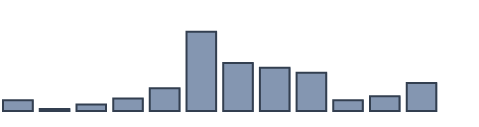
| Category | Series 0 |
|---|---|
| 0 | 3.416 |
| 1 | 0.616 |
| 2 | 2.044 |
| 3 | 3.952 |
| 4 | 7.178 |
| 5 | 25.004 |
| 6 | 15.139 |
| 7 | 13.667 |
| 8 | 12.096 |
| 9 | 3.42 |
| 10 | 4.634 |
| 11 | 8.835 |
| 12 | 0 |